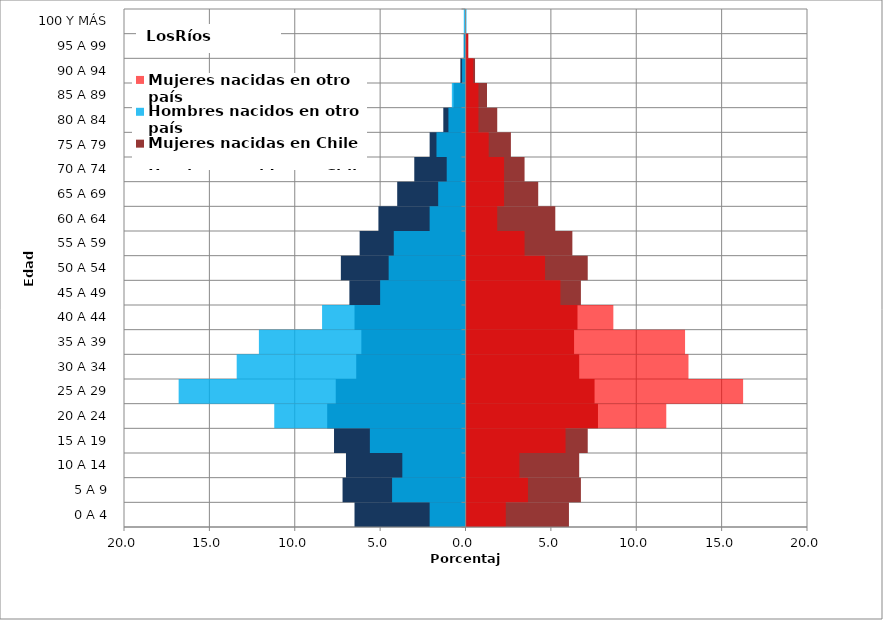
| Category | Hombres nacidos en Chile | Mujeres nacidas en Chile | Hombres nacidos en otro país | Mujeres nacidas en otro país |
|---|---|---|---|---|
| 0 A 4 | -6.5 | 6 | -2.1 | 2.3 |
| 5 A 9 | -7.2 | 6.7 | -4.3 | 3.6 |
| 10 A 14 | -7 | 6.6 | -3.7 | 3.1 |
| 15 A 19 | -7.7 | 7.1 | -5.6 | 5.8 |
| 20 A 24 | -8.1 | 7.7 | -11.2 | 11.7 |
| 25 A 29 | -7.6 | 7.5 | -16.8 | 16.2 |
| 30 A 34 | -6.4 | 6.6 | -13.4 | 13 |
| 35 A 39 | -6.1 | 6.3 | -12.1 | 12.8 |
| 40 A 44 | -6.5 | 6.5 | -8.4 | 8.6 |
| 45 A 49 | -6.8 | 6.7 | -5 | 5.5 |
| 50 A 54 | -7.3 | 7.1 | -4.5 | 4.6 |
| 55 A 59 | -6.2 | 6.2 | -4.2 | 3.4 |
| 60 A 64 | -5.1 | 5.2 | -2.1 | 1.8 |
| 65 A 69 | -4 | 4.2 | -1.6 | 2.2 |
| 70 A 74 | -3 | 3.4 | -1.1 | 2.2 |
| 75 A 79 | -2.1 | 2.6 | -1.7 | 1.3 |
| 80 A 84 | -1.3 | 1.8 | -1 | 0.7 |
| 85 A 89 | -0.7 | 1.2 | -0.8 | 0.7 |
| 90 A 94 | -0.3 | 0.5 | -0.2 | 0.4 |
| 95 A 99 | -0.1 | 0.1 | -0.1 | 0.1 |
| 100 Y MÁS | 0 | 0 | -0.1 | 0 |